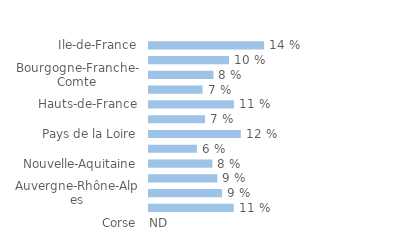
| Category | Series 0 |
|---|---|
| Ile-de-France | 0.144 |
| Centre-Val-de-Loire | 0.1 |
| Bourgogne-Franche-Comte | 0.081 |
| Normandie | 0.067 |
| Hauts-de-France | 0.106 |
| Grand-Est | 0.07 |
| Pays de la Loire | 0.115 |
| Bretagne | 0.06 |
| Nouvelle-Aquitaine | 0.08 |
| Occitanie | 0.086 |
| Auvergne-Rhône-Alpes | 0.092 |
| Provence-Alpes-Côte d'Azur | 0.106 |
| Corse | 0 |